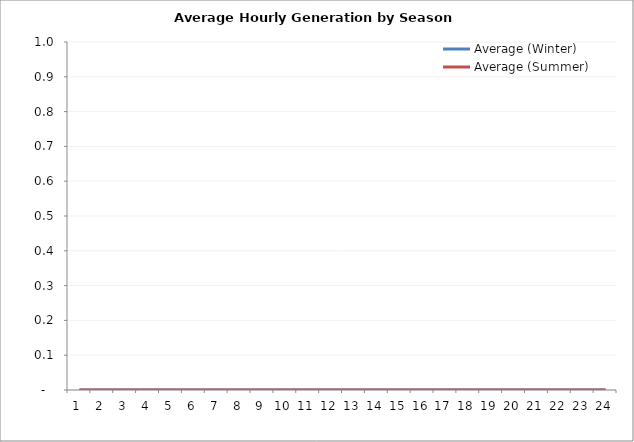
| Category | Average (Winter) | Average (Summer) |
|---|---|---|
| 1.0 | 0 | 0 |
| 2.0 | 0 | 0 |
| 3.0 | 0 | 0 |
| 4.0 | 0 | 0 |
| 5.0 | 0 | 0 |
| 6.0 | 0 | 0 |
| 7.0 | 0 | 0 |
| 8.0 | 0 | 0 |
| 9.0 | 0 | 0 |
| 10.0 | 0 | 0 |
| 11.0 | 0 | 0 |
| 12.0 | 0 | 0 |
| 13.0 | 0 | 0 |
| 14.0 | 0 | 0 |
| 15.0 | 0 | 0 |
| 16.0 | 0 | 0 |
| 17.0 | 0 | 0 |
| 18.0 | 0 | 0 |
| 19.0 | 0 | 0 |
| 20.0 | 0 | 0 |
| 21.0 | 0 | 0 |
| 22.0 | 0 | 0 |
| 23.0 | 0 | 0 |
| 24.0 | 0 | 0 |